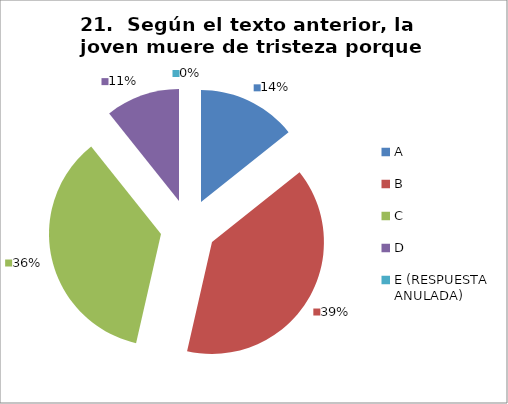
| Category | CANTIDAD DE RESPUESTAS PREGUNTA (21) | PORCENTAJE |
|---|---|---|
| A | 4 | 0.143 |
| B | 11 | 0.393 |
| C | 10 | 0.357 |
| D | 3 | 0.107 |
| E (RESPUESTA ANULADA) | 0 | 0 |